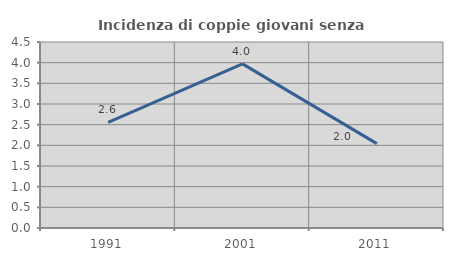
| Category | Incidenza di coppie giovani senza figli |
|---|---|
| 1991.0 | 2.556 |
| 2001.0 | 3.97 |
| 2011.0 | 2.041 |